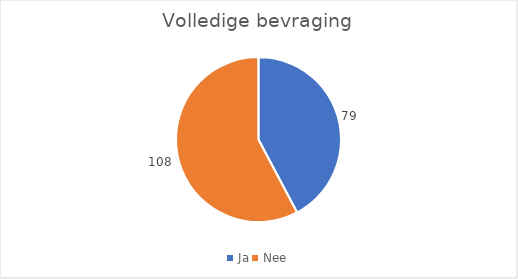
| Category | Series 0 |
|---|---|
| Ja | 79 |
| Nee | 108 |